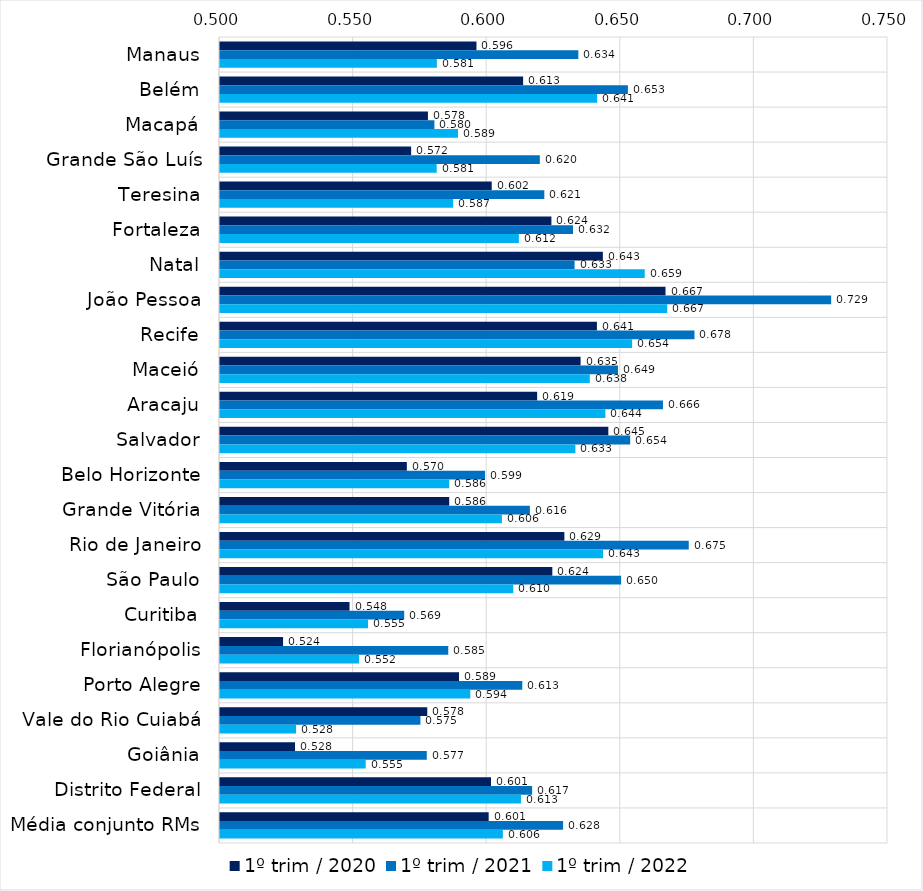
| Category | 1º trim / 2020 | 1º trim / 2021 | 1º trim / 2022 |
|---|---|---|---|
| Manaus | 0.596 | 0.634 | 0.581 |
| Belém | 0.613 | 0.653 | 0.641 |
| Macapá | 0.578 | 0.58 | 0.589 |
| Grande São Luís | 0.572 | 0.62 | 0.581 |
| Teresina | 0.602 | 0.621 | 0.587 |
| Fortaleza | 0.624 | 0.632 | 0.612 |
| Natal | 0.643 | 0.633 | 0.659 |
| João Pessoa | 0.667 | 0.729 | 0.667 |
| Recife | 0.641 | 0.678 | 0.654 |
| Maceió | 0.635 | 0.649 | 0.638 |
| Aracaju | 0.619 | 0.666 | 0.644 |
| Salvador | 0.645 | 0.654 | 0.633 |
| Belo Horizonte | 0.57 | 0.599 | 0.586 |
| Grande Vitória | 0.586 | 0.616 | 0.606 |
| Rio de Janeiro | 0.629 | 0.675 | 0.643 |
| São Paulo | 0.624 | 0.65 | 0.61 |
| Curitiba | 0.548 | 0.569 | 0.555 |
| Florianópolis | 0.524 | 0.585 | 0.552 |
| Porto Alegre | 0.589 | 0.613 | 0.594 |
| Vale do Rio Cuiabá | 0.578 | 0.575 | 0.528 |
| Goiânia | 0.528 | 0.577 | 0.555 |
| Distrito Federal | 0.601 | 0.617 | 0.613 |
| Média conjunto RMs | 0.601 | 0.628 | 0.606 |